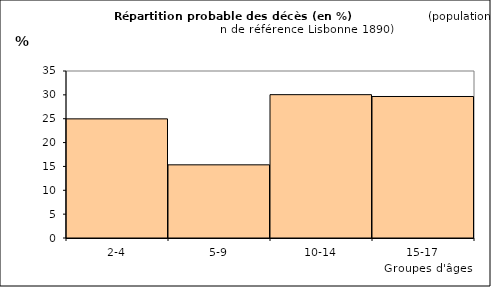
| Category | Series 0 |
|---|---|
| 2-4 | 24.967 |
| 5-9 | 15.335 |
| 10-14 | 30.041 |
| 15-17 | 29.656 |